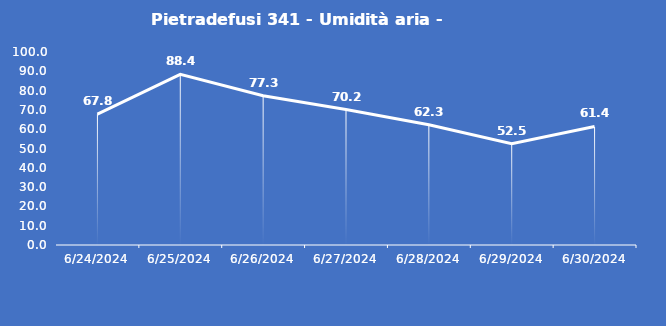
| Category | Pietradefusi 341 - Umidità aria - Grezzo (%) |
|---|---|
| 6/24/24 | 67.8 |
| 6/25/24 | 88.4 |
| 6/26/24 | 77.3 |
| 6/27/24 | 70.2 |
| 6/28/24 | 62.3 |
| 6/29/24 | 52.5 |
| 6/30/24 | 61.4 |